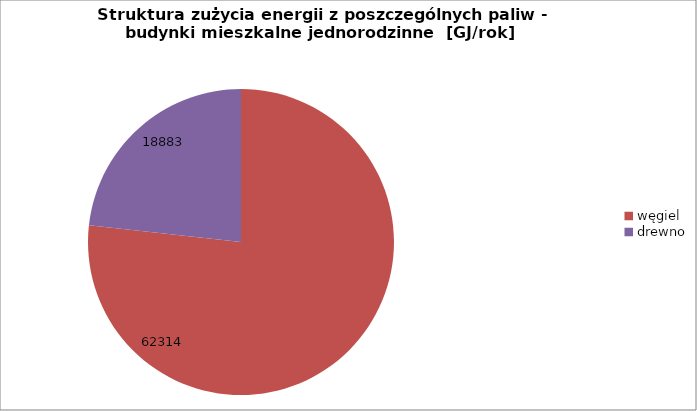
| Category | Series 0 |
|---|---|
| węgiel | 62314.189 |
| drewno | 18882.772 |